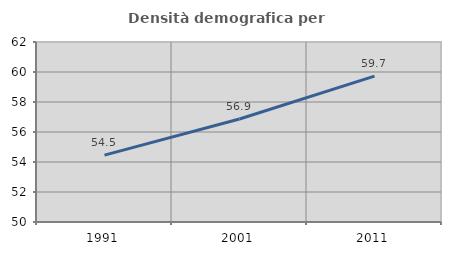
| Category | Densità demografica |
|---|---|
| 1991.0 | 54.459 |
| 2001.0 | 56.869 |
| 2011.0 | 59.728 |